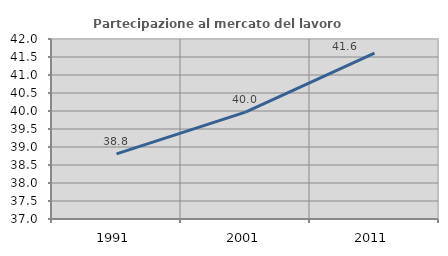
| Category | Partecipazione al mercato del lavoro  femminile |
|---|---|
| 1991.0 | 38.81 |
| 2001.0 | 39.967 |
| 2011.0 | 41.609 |